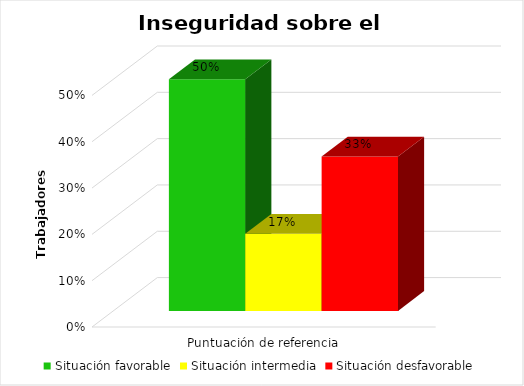
| Category | Situación favorable | Situación intermedia  | Situación desfavorable |
|---|---|---|---|
| 0 | 0.5 | 0.167 | 0.333 |